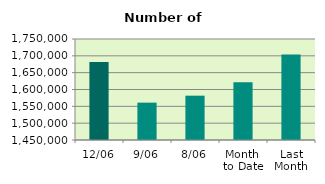
| Category | Series 0 |
|---|---|
| 12/06 | 1681566 |
| 9/06 | 1560932 |
| 8/06 | 1581642 |
| Month 
to Date | 1621901.25 |
| Last
Month | 1704183.636 |